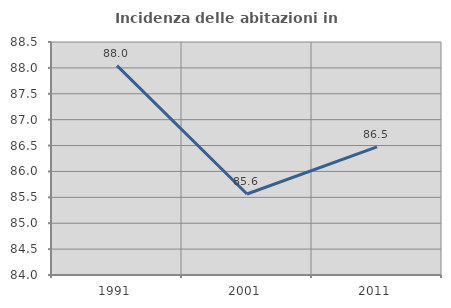
| Category | Incidenza delle abitazioni in proprietà  |
|---|---|
| 1991.0 | 88.043 |
| 2001.0 | 85.564 |
| 2011.0 | 86.473 |